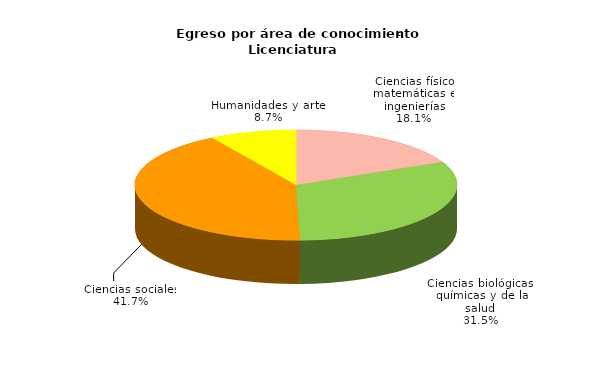
| Category | Series 0 |
|---|---|
| Ciencias físico matemáticas e ingenierías | 6295 |
| Ciencias biológicas, químicas y de la salud | 10925 |
| Ciencias sociales | 14469 |
| Humanidades y artes | 3015 |